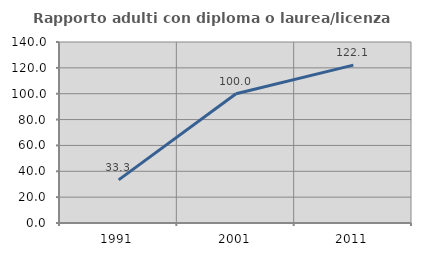
| Category | Rapporto adulti con diploma o laurea/licenza media  |
|---|---|
| 1991.0 | 33.333 |
| 2001.0 | 100 |
| 2011.0 | 122.105 |